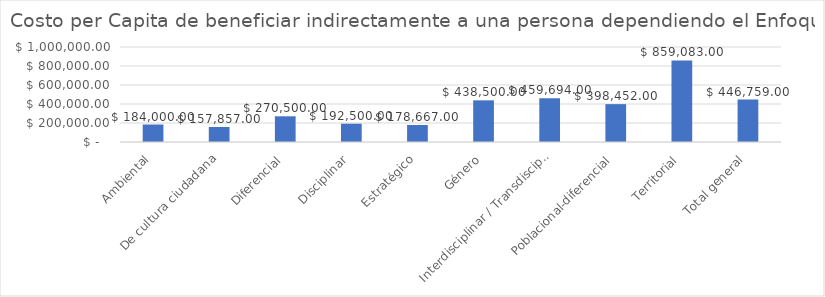
| Category | Promedio de Costo percapita beneficiario indirecto |
|---|---|
| Ambiental | 184000 |
| De cultura ciudadana | 157857 |
| Diferencial | 270500 |
| Disciplinar | 192500 |
| Estratégico | 178667 |
| Género | 438500 |
| Interdisciplinar / Transdisciplinar | 459694 |
| Poblacional-diferencial | 398452 |
| Territorial | 859083 |
| Total general | 446759 |